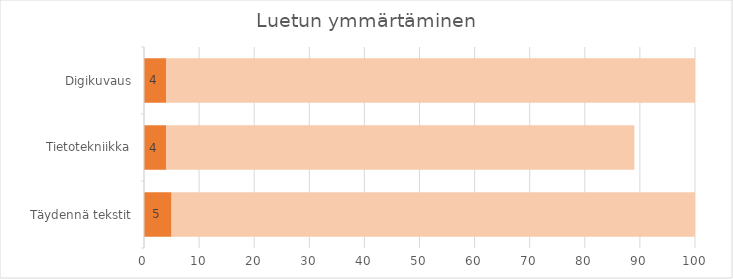
| Category | Series 0 | 95 |
|---|---|---|
| Täydennä tekstit | 5 | 95 |
| Tietotekniikka | 4 | 85 |
| Digikuvaus | 4 | 96 |